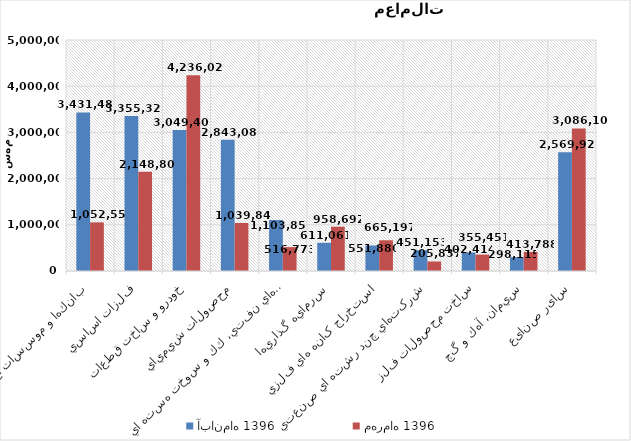
| Category | آبان‌ماه 1396 | مهرماه 1396 |
|---|---|---|
| بانكها و موسسات اعتباري | 3431489.449 | 1052553.694 |
| فلزات اساسي | 3355328.206 | 2148808.005 |
| خودرو و ساخت قطعات | 3049399.812 | 4236023.736 |
| محصولات شيميايي | 2843084.657 | 1039849.355 |
| فراورده هاي نفتي، كك و سوخت هسته اي | 1103852.087 | 516773.486 |
| سرمايه گذاريها | 611060.76 | 958692.26 |
| استخراج کانه هاي فلزي | 551879.619 | 665197.289 |
| شرکتهاي چند رشته اي صنعتي | 451153.205 | 205836.839 |
| ساخت محصولات فلزي | 402413.932 | 355451.08 |
| سيمان، آهك و گچ | 298115.353 | 413788.196 |
| سایر صنایع | 2569927.696 | 3086099.516 |